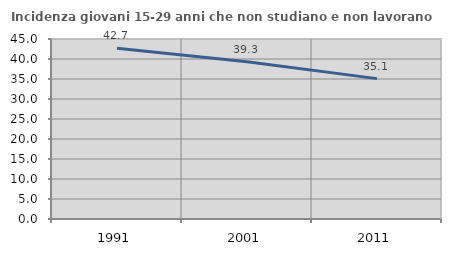
| Category | Incidenza giovani 15-29 anni che non studiano e non lavorano  |
|---|---|
| 1991.0 | 42.685 |
| 2001.0 | 39.309 |
| 2011.0 | 35.095 |